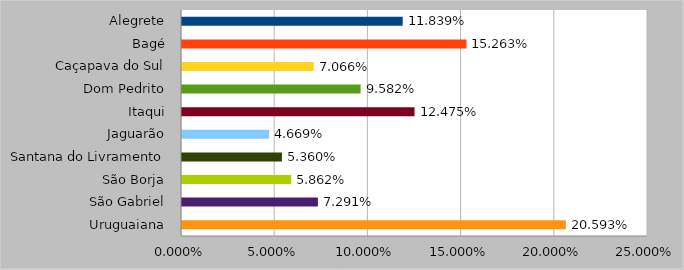
| Category | MATRIZ                  (% de Alunos Equivalentes) |
|---|---|
| Alegrete | 0.118 |
| Bagé | 0.153 |
| Caçapava do Sul | 0.071 |
| Dom Pedrito | 0.096 |
| Itaqui | 0.125 |
| Jaguarão | 0.047 |
| Santana do Livramento | 0.054 |
| São Borja | 0.059 |
| São Gabriel | 0.073 |
| Uruguaiana | 0.206 |